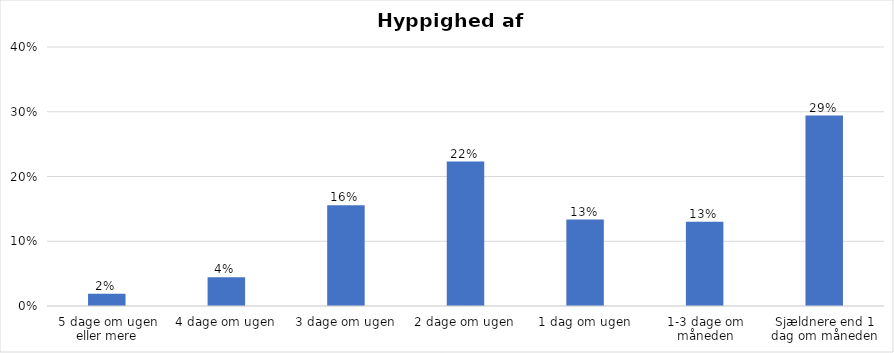
| Category | % |
|---|---|
| 5 dage om ugen eller mere | 0.019 |
| 4 dage om ugen | 0.044 |
| 3 dage om ugen | 0.156 |
| 2 dage om ugen | 0.223 |
| 1 dag om ugen | 0.134 |
| 1-3 dage om måneden | 0.13 |
| Sjældnere end 1 dag om måneden | 0.294 |